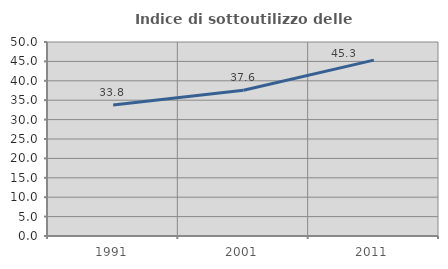
| Category | Indice di sottoutilizzo delle abitazioni  |
|---|---|
| 1991.0 | 33.758 |
| 2001.0 | 37.563 |
| 2011.0 | 45.334 |